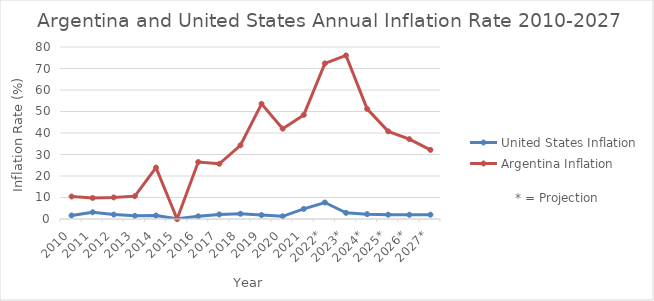
| Category | United States Inflation | Argentina Inflation |
|---|---|---|
| 2010 | 1.64 | 10.46 |
| 2011 | 3.14 | 9.78 |
| 2012 | 2.07 | 10.04 |
| 2013 | 1.47 | 10.62 |
| 2014 | 1.62 | 23.9 |
| 2015 | 0.12 | 0 |
| 2016 | 1.26 | 26.5 |
| 2017 | 2.13 | 25.68 |
| 2018 | 2.44 | 34.28 |
| 2019 | 1.81 | 53.55 |
| 2020 | 1.25 | 42.02 |
| 2021 | 4.69 | 48.41 |
| 2022* | 7.68 | 72.37 |
| 2023* | 2.86 | 76.07 |
| 2024* | 2.26 | 51.21 |
| 2025* | 2 | 40.76 |
| 2026* | 1.97 | 37.14 |
| 2027* | 2 | 32.16 |